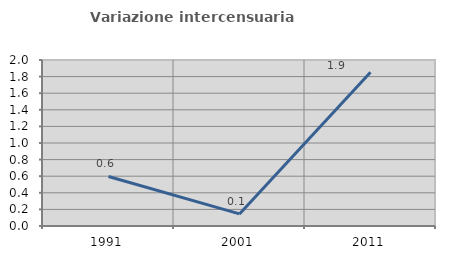
| Category | Variazione intercensuaria annua |
|---|---|
| 1991.0 | 0.597 |
| 2001.0 | 0.146 |
| 2011.0 | 1.853 |